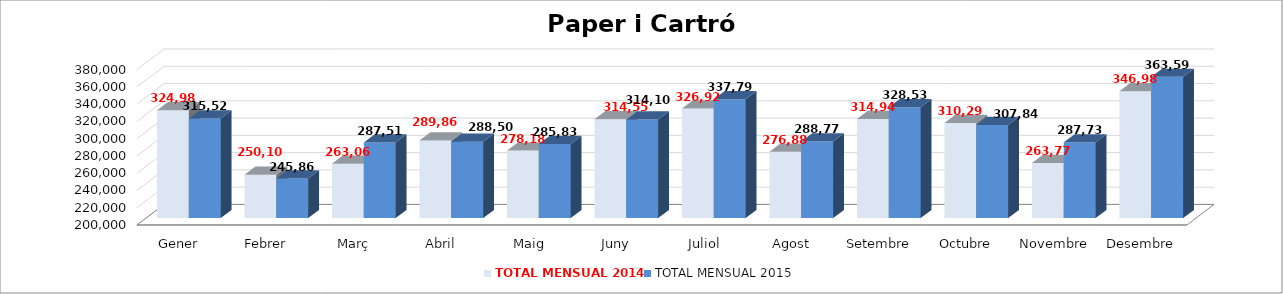
| Category | TOTAL MENSUAL 2014 | TOTAL MENSUAL 2015 |
|---|---|---|
| Gener | 324984.01 | 315519.75 |
| Febrer | 250102.01 | 245860.03 |
| Març | 263062.04 | 287510.46 |
| Abril | 289859.98 | 288500.13 |
| Maig | 278185.03 | 285830.34 |
| Juny | 314558.97 | 314100.02 |
| Juliol | 326920 | 337795.6 |
| Agost | 276880 | 288770.03 |
| Setembre | 314940 | 328538.84 |
| Octubre | 310290 | 307839.97 |
| Novembre | 263770 | 287736.6 |
| Desembre | 346983.97 | 363589.935 |